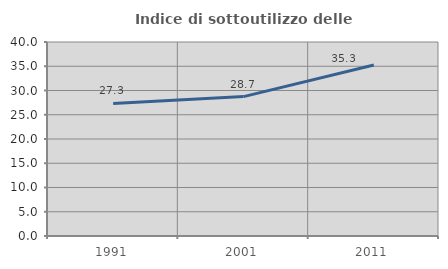
| Category | Indice di sottoutilizzo delle abitazioni  |
|---|---|
| 1991.0 | 27.326 |
| 2001.0 | 28.745 |
| 2011.0 | 35.257 |